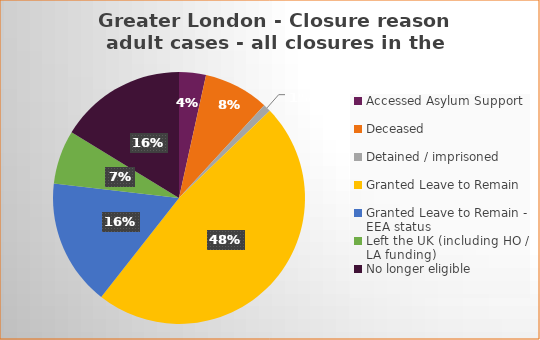
| Category | Total | Percentage |
|---|---|---|
| Accessed Asylum Support | 7 | 0.04 |
| Deceased | 17 | 0.084 |
| Detained / imprisoned | 2 | 0.01 |
| Granted Leave to Remain | 97 | 0.478 |
| Granted Leave to Remain - EEA status | 33 | 0.163 |
| Left the UK (including HO / LA funding)  | 14 | 0.069 |
| No longer eligible | 33 | 0.163 |